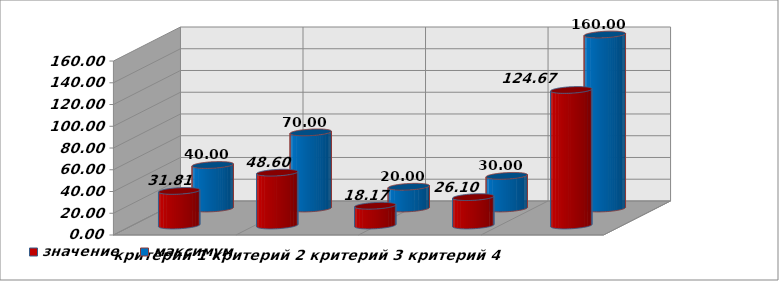
| Category | значение | максимум |
|---|---|---|
| критерий 1 | 31.805 | 40 |
| критерий 2 | 48.596 | 70 |
| критерий 3 | 18.165 | 20 |
| критерий 4 | 26.105 | 30 |